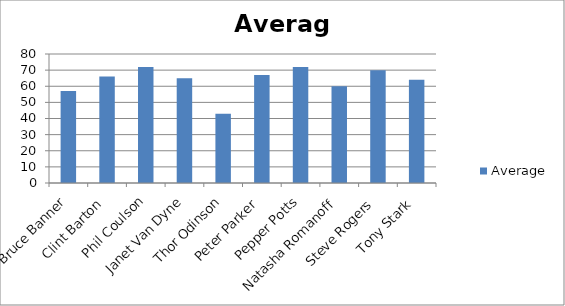
| Category | Average |
|---|---|
| Bruce Banner | 57 |
| Clint Barton | 66 |
| Phil Coulson | 72 |
| Janet Van Dyne | 65 |
| Thor Odinson | 43 |
| Peter Parker | 67 |
| Pepper Potts | 72 |
| Natasha Romanoff | 60 |
| Steve Rogers | 70 |
| Tony Stark | 64 |